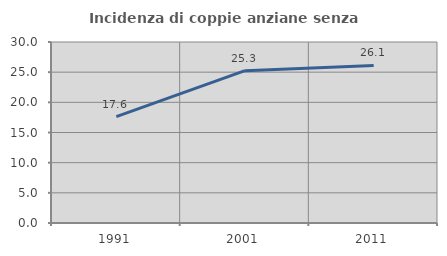
| Category | Incidenza di coppie anziane senza figli  |
|---|---|
| 1991.0 | 17.626 |
| 2001.0 | 25.253 |
| 2011.0 | 26.107 |